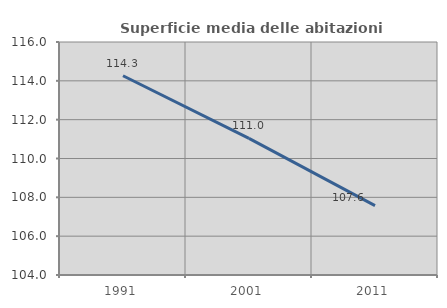
| Category | Superficie media delle abitazioni occupate |
|---|---|
| 1991.0 | 114.263 |
| 2001.0 | 111.037 |
| 2011.0 | 107.573 |